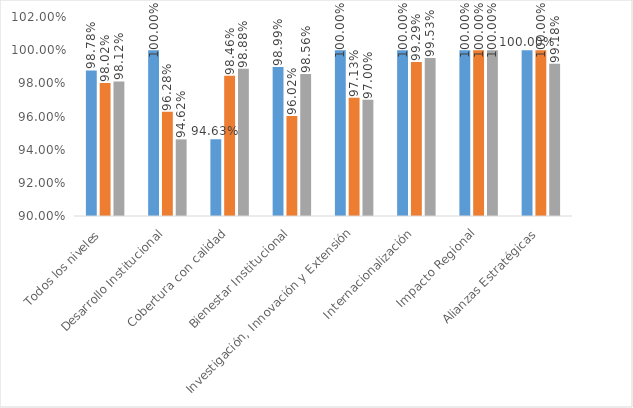
| Category | Objetivo | Componentes | Proyectos |
|---|---|---|---|
| Todos los niveles | 0.988 | 0.98 | 0.981 |
| Desarrollo Institucional | 1 | 0.963 | 0.946 |
| Cobertura con calidad | 0.946 | 0.985 | 0.989 |
| Bienestar Institucional | 0.99 | 0.96 | 0.986 |
| Investigación, Innovación y Extensión | 1 | 0.971 | 0.97 |
| Internacionalización | 1 | 0.993 | 0.995 |
| Impacto Regional | 1 | 1 | 1 |
| Alianzas Estratégicas | 1 | 1 | 0.992 |